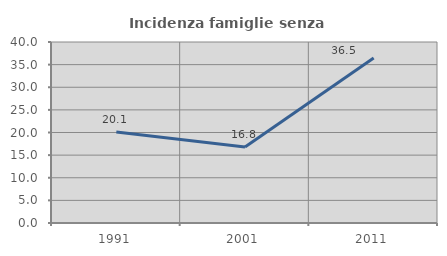
| Category | Incidenza famiglie senza nuclei |
|---|---|
| 1991.0 | 20.101 |
| 2001.0 | 16.818 |
| 2011.0 | 36.471 |